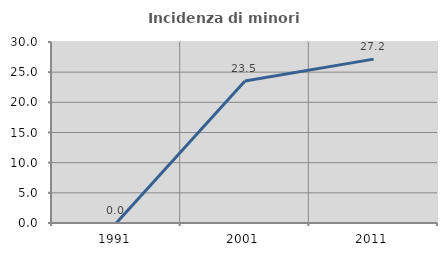
| Category | Incidenza di minori stranieri |
|---|---|
| 1991.0 | 0 |
| 2001.0 | 23.529 |
| 2011.0 | 27.16 |